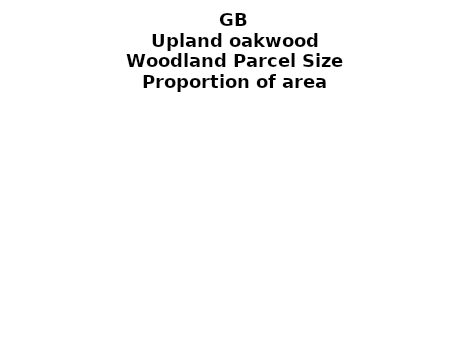
| Category | Upland oakwood |
|---|---|
| <5 ha | 0.119 |
| ≥5 and <10 ha | 0.091 |
| ≥10 and <15 ha | 0.036 |
| ≥15 and <20 ha | 0.046 |
| ≥20 and <25 ha | 0.058 |
| ≥25 and <30 ha | 0.029 |
| ≥30 and <35 ha | 0.019 |
| ≥35 and <40 ha | 0.02 |
| ≥40 and <45 ha | 0.016 |
| ≥45 and <50 ha | 0.016 |
| ≥50 and <60 ha | 0.046 |
| ≥60 and <70 ha | 0.023 |
| ≥70 and <80 ha | 0.018 |
| ≥80 and <90 ha | 0.018 |
| ≥90 and <100 ha | 0.017 |
| ≥100 and <150 ha | 0.084 |
| ≥150 and <200 ha | 0.048 |
| ≥200 ha | 0.296 |